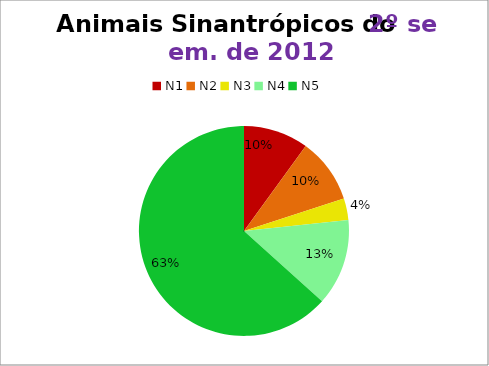
| Category | 2º/12 |
|---|---|
| N1 | 3 |
| N2 | 3 |
| N3 | 1 |
| N4 | 4 |
| N5 | 19 |